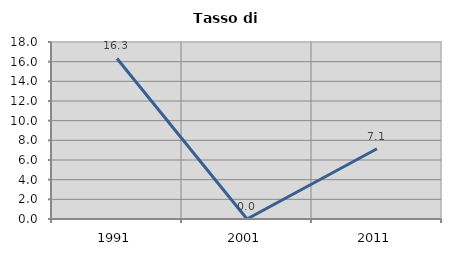
| Category | Tasso di disoccupazione   |
|---|---|
| 1991.0 | 16.327 |
| 2001.0 | 0 |
| 2011.0 | 7.143 |